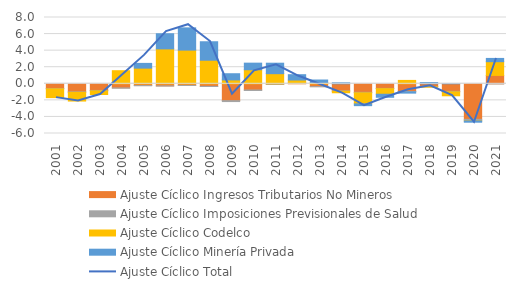
| Category | Ajuste Cíclico Ingresos Tributarios No Mineros | Ajuste Cíclico Imposiciones Previsionales de Salud | Ajuste Cíclico Codelco | Ajuste Cíclico Minería Privada |
|---|---|---|---|---|
| 2001.0 | -0.576 | -0.034 | -1.059 | 0 |
| 2002.0 | -0.975 | -0.054 | -1.055 | 0 |
| 2003.0 | -0.804 | -0.05 | -0.441 | 0 |
| 2004.0 | -0.497 | -0.033 | 1.579 | 0 |
| 2005.0 | -0.214 | -0.016 | 1.889 | 0.573 |
| 2006.0 | -0.253 | -0.017 | 4.213 | 1.826 |
| 2007.0 | -0.19 | -0.013 | 4.065 | 2.684 |
| 2008.0 | -0.311 | -0.019 | 2.845 | 2.229 |
| 2009.0 | -2.036 | -0.11 | 0.469 | 0.745 |
| 2010.0 | -0.748 | -0.06 | 1.695 | 0.795 |
| 2011.0 | -0.061 | -0.006 | 1.22 | 1.264 |
| 2012.0 | 0.068 | 0.003 | 0.385 | 0.642 |
| 2013.0 | -0.337 | -0.02 | 0.148 | 0.307 |
| 2014.0 | -0.854 | -0.049 | -0.181 | 0.117 |
| 2015.0 | -1.031 | -0.058 | -1.334 | -0.217 |
| 2016.0 | -0.558 | -0.031 | -0.674 | -0.365 |
| 2017.0 | -0.924 | -0.054 | 0.407 | -0.148 |
| 2018.0 | -0.339 | -0.025 | -0.036 | 0.152 |
| 2019.0 | -0.916 | -0.057 | -0.475 | 0.03 |
| 2020.0 | -4.288 | -0.193 | -0.008 | -0.147 |
| 2021.0 | 1.008 | -0.011 | 1.659 | 0.394 |